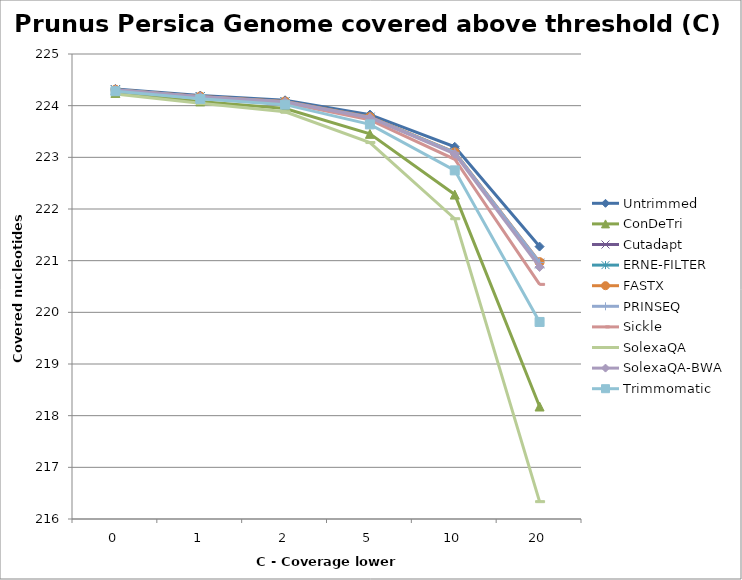
| Category | Untrimmed | ConDeTri | Cutadapt | ERNE-FILTER | FASTX | PRINSEQ | Sickle | SolexaQA | SolexaQA-BWA | Trimmomatic |
|---|---|---|---|---|---|---|---|---|---|---|
| 0.0 | 224323338 | 224247117 | 224309067 | 224307159 | 224308851 | 224306936 | 224296366 | 224227116 | 224305015 | 224279542 |
| 1.0 | 224194735 | 224082960 | 224175388 | 224173918 | 224176967 | 224174946 | 224158604 | 224044695 | 224171188 | 224131877 |
| 2.0 | 224103596 | 223946181 | 224077939 | 224076345 | 224079453 | 224078347 | 224054323 | 223882140 | 224072612 | 224019654 |
| 5.0 | 223827245 | 223454475 | 223775715 | 223773573 | 223780164 | 223778840 | 223724485 | 223285898 | 223766370 | 223637816 |
| 10.0 | 223203904 | 222279319 | 223090744 | 223086527 | 223097893 | 223094931 | 222962457 | 221811301 | 223066700 | 222747455 |
| 20.0 | 221272395 | 218177388 | 220951899 | 220936477 | 220971486 | 220964902 | 220541246 | 216335939 | 220877939 | 219813761 |